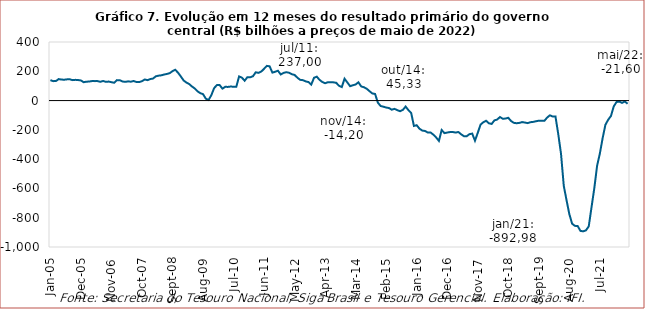
| Category | Resultado primário |
|---|---|
| 2005-01-01 | 139457.117 |
| 2005-02-01 | 132631.27 |
| 2005-03-01 | 133668.773 |
| 2005-04-01 | 146710.087 |
| 2005-05-01 | 143354.863 |
| 2005-06-01 | 142563.293 |
| 2005-07-01 | 144883.885 |
| 2005-08-01 | 145176.633 |
| 2005-09-01 | 139511.819 |
| 2005-10-01 | 141577.975 |
| 2005-11-01 | 140084.583 |
| 2005-12-01 | 137364.637 |
| 2006-01-01 | 125294.824 |
| 2006-02-01 | 129002.606 |
| 2006-03-01 | 129918.543 |
| 2006-04-01 | 133361.187 |
| 2006-05-01 | 132777.568 |
| 2006-06-01 | 132906.769 |
| 2006-07-01 | 128135.448 |
| 2006-08-01 | 133961.611 |
| 2006-09-01 | 127725.929 |
| 2006-10-01 | 129718.508 |
| 2006-11-01 | 125644.679 |
| 2006-12-01 | 121585.428 |
| 2007-01-01 | 139604.492 |
| 2007-02-01 | 139076.656 |
| 2007-03-01 | 130257.879 |
| 2007-04-01 | 127767.645 |
| 2007-05-01 | 131369.629 |
| 2007-06-01 | 128786.57 |
| 2007-07-01 | 133633.183 |
| 2007-08-01 | 126787.067 |
| 2007-09-01 | 125948.315 |
| 2007-10-01 | 132466.542 |
| 2007-11-01 | 143948.551 |
| 2007-12-01 | 139244.173 |
| 2008-01-01 | 146901.007 |
| 2008-02-01 | 150517.463 |
| 2008-03-01 | 165687.013 |
| 2008-04-01 | 170091.369 |
| 2008-05-01 | 172537.156 |
| 2008-06-01 | 177989.865 |
| 2008-07-01 | 181850.059 |
| 2008-08-01 | 187193.56 |
| 2008-09-01 | 200848.18 |
| 2008-10-01 | 210566.966 |
| 2008-11-01 | 190090.918 |
| 2008-12-01 | 164671.272 |
| 2009-01-01 | 137575.115 |
| 2009-02-01 | 123013.456 |
| 2009-03-01 | 112995.324 |
| 2009-04-01 | 96400.859 |
| 2009-05-01 | 82939.46 |
| 2009-06-01 | 63662.079 |
| 2009-07-01 | 50683.919 |
| 2009-08-01 | 43884.14 |
| 2009-09-01 | 13355.267 |
| 2009-10-01 | 4248.627 |
| 2009-11-01 | 36816.404 |
| 2009-12-01 | 85222.188 |
| 2010-01-01 | 105573.942 |
| 2010-02-01 | 105540.133 |
| 2010-03-01 | 81522.969 |
| 2010-04-01 | 93782.745 |
| 2010-05-01 | 93377.799 |
| 2010-06-01 | 95980.348 |
| 2010-07-01 | 94221.816 |
| 2010-08-01 | 94899.088 |
| 2010-09-01 | 164903.634 |
| 2010-10-01 | 156554.243 |
| 2010-11-01 | 135596.951 |
| 2010-12-01 | 159966.527 |
| 2011-01-01 | 158846.711 |
| 2011-02-01 | 166308.952 |
| 2011-03-01 | 193225.49 |
| 2011-04-01 | 189217.048 |
| 2011-05-01 | 198239.168 |
| 2011-06-01 | 217078.693 |
| 2011-07-01 | 236997.597 |
| 2011-08-01 | 233913.475 |
| 2011-09-01 | 190823.354 |
| 2011-10-01 | 196819.835 |
| 2011-11-01 | 203799.278 |
| 2011-12-01 | 178142.613 |
| 2012-01-01 | 188771.568 |
| 2012-02-01 | 193803.212 |
| 2012-03-01 | 190181.184 |
| 2012-04-01 | 180117.463 |
| 2012-05-01 | 175015.459 |
| 2012-06-01 | 156189.943 |
| 2012-07-01 | 141686.355 |
| 2012-08-01 | 139339.952 |
| 2012-09-01 | 131146.495 |
| 2012-10-01 | 126440.759 |
| 2012-11-01 | 109057.417 |
| 2012-12-01 | 155630.87 |
| 2013-01-01 | 163099.924 |
| 2013-02-01 | 141350.924 |
| 2013-03-01 | 126829.391 |
| 2013-04-01 | 118401.663 |
| 2013-05-01 | 125298.699 |
| 2013-06-01 | 125422.832 |
| 2013-07-01 | 124407.881 |
| 2013-08-01 | 121301.201 |
| 2013-09-01 | 101043.693 |
| 2013-10-01 | 92444.693 |
| 2013-11-01 | 149150.094 |
| 2013-12-01 | 123980.763 |
| 2014-01-01 | 98335.314 |
| 2014-02-01 | 104559.85 |
| 2014-03-01 | 110103.849 |
| 2014-04-01 | 124885.482 |
| 2014-05-01 | 96593.138 |
| 2014-06-01 | 90843.36 |
| 2014-07-01 | 80696.271 |
| 2014-08-01 | 64068.437 |
| 2014-09-01 | 48905.281 |
| 2014-10-01 | 45334.615 |
| 2014-11-01 | -14202.262 |
| 2014-12-01 | -36895.137 |
| 2015-01-01 | -41771.543 |
| 2015-02-01 | -47720.762 |
| 2015-03-01 | -50827.145 |
| 2015-04-01 | -62271.595 |
| 2015-05-01 | -56422.131 |
| 2015-06-01 | -65378.466 |
| 2015-07-01 | -72605.747 |
| 2015-08-01 | -63819.615 |
| 2015-09-01 | -40877.576 |
| 2015-10-01 | -64909.676 |
| 2015-11-01 | -84125.386 |
| 2015-12-01 | -173360.698 |
| 2016-01-01 | -168243.265 |
| 2016-02-01 | -192285.706 |
| 2016-03-01 | -204879.095 |
| 2016-04-01 | -207649.466 |
| 2016-05-01 | -218123.496 |
| 2016-06-01 | -218140.351 |
| 2016-07-01 | -232807.25 |
| 2016-08-01 | -251874.669 |
| 2016-09-01 | -275477.603 |
| 2016-10-01 | -201132.68 |
| 2016-11-01 | -222276.868 |
| 2016-12-01 | -218401.61 |
| 2017-01-01 | -215017.808 |
| 2017-02-01 | -214638.337 |
| 2017-03-01 | -218686.706 |
| 2017-04-01 | -214517.768 |
| 2017-05-01 | -230127.08 |
| 2017-06-01 | -243143.761 |
| 2017-07-01 | -243682.124 |
| 2017-08-01 | -229556.469 |
| 2017-09-01 | -225522.684 |
| 2017-10-01 | -274004.711 |
| 2017-11-01 | -220544.825 |
| 2017-12-01 | -164120.311 |
| 2018-01-01 | -148092.299 |
| 2018-02-01 | -137892.659 |
| 2018-03-01 | -154682.648 |
| 2018-04-01 | -159816.12 |
| 2018-05-01 | -135100.882 |
| 2018-06-01 | -129589.207 |
| 2018-07-01 | -112394.457 |
| 2018-08-01 | -123963.816 |
| 2018-09-01 | -122917.322 |
| 2018-10-01 | -117634.562 |
| 2018-11-01 | -139707.235 |
| 2018-12-01 | -152192.797 |
| 2019-01-01 | -154670.398 |
| 2019-02-01 | -152506.029 |
| 2019-03-01 | -146896.477 |
| 2019-04-01 | -150083.294 |
| 2019-05-01 | -154022.379 |
| 2019-06-01 | -147717.996 |
| 2019-07-01 | -145514.475 |
| 2019-08-01 | -141209.661 |
| 2019-09-01 | -137259.56 |
| 2019-10-01 | -138566.064 |
| 2019-11-01 | -138352.553 |
| 2019-12-01 | -116080.325 |
| 2020-01-01 | -100631.012 |
| 2020-02-01 | -108905.817 |
| 2020-03-01 | -108123.26 |
| 2020-04-01 | -228015.721 |
| 2020-05-01 | -362771.805 |
| 2020-06-01 | -582893.02 |
| 2020-07-01 | -681060.909 |
| 2020-08-01 | -775431.338 |
| 2020-09-01 | -840883.932 |
| 2020-10-01 | -855556.698 |
| 2020-11-01 | -856688.53 |
| 2020-12-01 | -889942.771 |
| 2021-01-01 | -892979.737 |
| 2021-02-01 | -886292.523 |
| 2021-03-01 | -858652.809 |
| 2021-04-01 | -728030.84 |
| 2021-05-01 | -598557.071 |
| 2021-06-01 | -445577.484 |
| 2021-07-01 | -361613.316 |
| 2021-08-01 | -256516.375 |
| 2021-09-01 | -165314.859 |
| 2021-10-01 | -130934.416 |
| 2021-11-01 | -105174.364 |
| 2021-12-01 | -39786.389 |
| 2022-01-01 | -10047.176 |
| 2022-02-01 | -6988.923 |
| 2022-03-01 | -15693.911 |
| 2022-04-01 | -6137.145 |
| 2022-05-01 | -21597.894 |